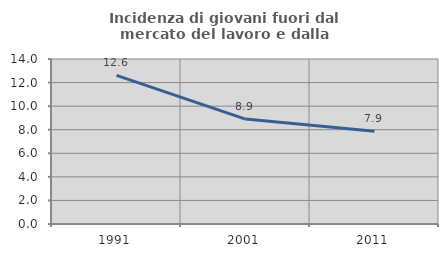
| Category | Incidenza di giovani fuori dal mercato del lavoro e dalla formazione  |
|---|---|
| 1991.0 | 12.604 |
| 2001.0 | 8.899 |
| 2011.0 | 7.874 |